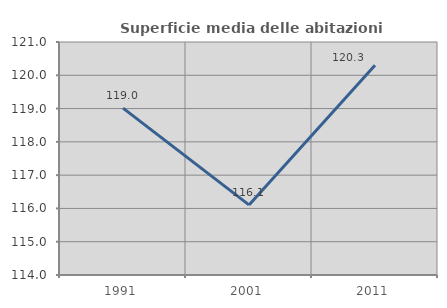
| Category | Superficie media delle abitazioni occupate |
|---|---|
| 1991.0 | 119.013 |
| 2001.0 | 116.106 |
| 2011.0 | 120.298 |